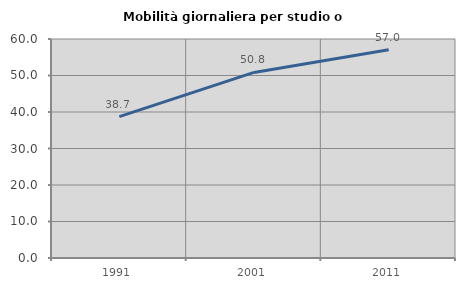
| Category | Mobilità giornaliera per studio o lavoro |
|---|---|
| 1991.0 | 38.729 |
| 2001.0 | 50.849 |
| 2011.0 | 57.046 |